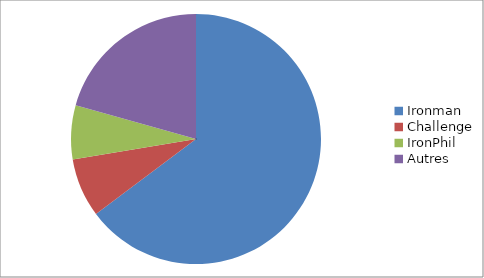
| Category | Series 0 |
|---|---|
| Ironman | 204 |
| Challenge | 24 |
| IronPhil | 22 |
| Autres | 65 |